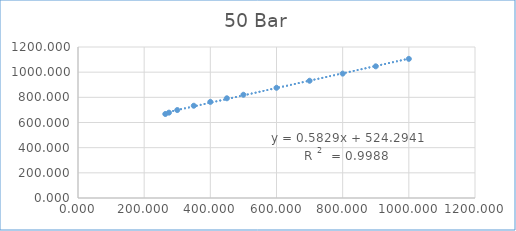
| Category | Series 0 |
|---|---|
| 263.9 | 667.511 |
| 275.0 | 678.333 |
| 300.0 | 698.925 |
| 350.0 | 733.23 |
| 400.0 | 763.665 |
| 450.0 | 792.451 |
| 500.0 | 820.521 |
| 600.0 | 875.968 |
| 700.0 | 931.749 |
| 800.0 | 988.462 |
| 900.0 | 1046.393 |
| 1000.0 | 1105.662 |